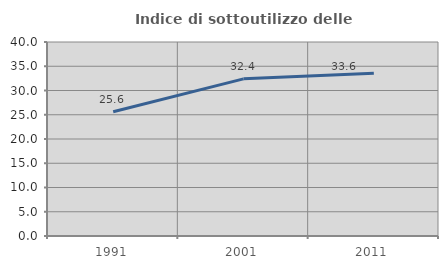
| Category | Indice di sottoutilizzo delle abitazioni  |
|---|---|
| 1991.0 | 25.622 |
| 2001.0 | 32.405 |
| 2011.0 | 33.571 |